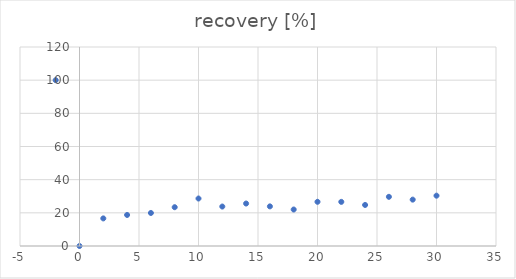
| Category | recovery [%] |
|---|---|
| -2.0 | 100 |
| 0.0 | 0 |
| 2.0 | 16.642 |
| 4.0 | 18.715 |
| 6.0 | 19.913 |
| 8.0 | 23.395 |
| 10.0 | 28.638 |
| 12.0 | 23.792 |
| 14.0 | 25.612 |
| 16.0 | 23.897 |
| 18.0 | 21.999 |
| 20.0 | 26.657 |
| 22.0 | 26.612 |
| 24.0 | 24.743 |
| 26.0 | 29.651 |
| 28.0 | 27.964 |
| 30.0 | 30.345 |